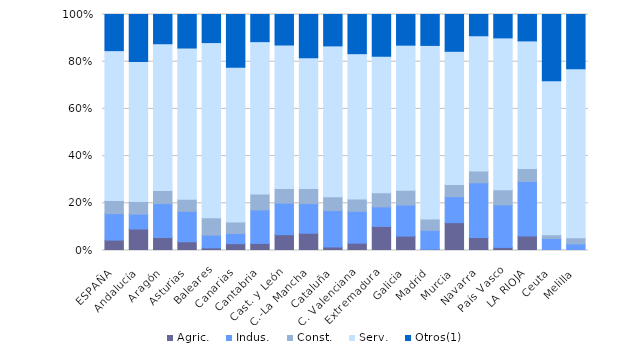
| Category | Agric. | Indus. | Const. | Serv. | Otros(1) |
|---|---|---|---|---|---|
| ESPAÑA | 4.4 | 11.2 | 5.6 | 63.4 | 15.3 |
| Andalucía | 9.1 | 6.3 | 5.4 | 59.3 | 19.9 |
| Aragón | 5.5 | 14.4 | 5.5 | 62.3 | 12.4 |
| Asturias | 3.7 | 12.9 | 5.1 | 64.1 | 14.2 |
| Baleares | 1.1 | 5.4 | 7.4 | 74.2 | 11.9 |
| Canarias | 2.9 | 4.3 | 4.9 | 65.5 | 22.4 |
| Cantabria | 3 | 14.2 | 6.7 | 64.6 | 11.5 |
| Cast. y León | 6.7 | 13.3 | 6.2 | 60.7 | 12.9 |
| C.-La Mancha | 7.3 | 12.6 | 6.4 | 55.5 | 18.3 |
| Cataluña | 1.5 | 15.4 | 5.9 | 63.9 | 13.3 |
| C. Valenciana | 3.1 | 13.5 | 5.2 | 61.6 | 16.6 |
| Extremadura | 10.2 | 8.3 | 6 | 57.8 | 17.7 |
| Galicia | 6.1 | 13.2 | 6.3 | 61.5 | 13 |
| Madrid | 0.5 | 8 | 4.8 | 73.6 | 13.1 |
| Murcia | 11.8 | 11 | 5.2 | 56.4 | 15.6 |
| Navarra | 5.5 | 23.2 | 5 | 57.3 | 9 |
| País Vasco | 1.3 | 18 | 6.4 | 64.3 | 9.9 |
| LA RIOJA | 6.2 | 23.1 | 5.5 | 54.1 | 11.2 |
| Ceuta | 0.3 | 4.8 | 1.6 | 65.2 | 28.1 |
| Melilla | 0 | 2.8 | 2.6 | 71.5 | 23 |